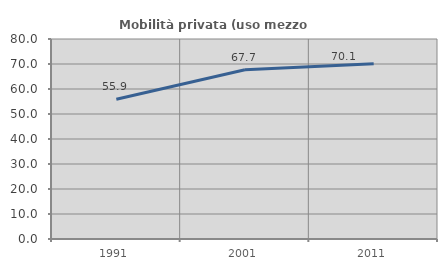
| Category | Mobilità privata (uso mezzo privato) |
|---|---|
| 1991.0 | 55.909 |
| 2001.0 | 67.674 |
| 2011.0 | 70.119 |